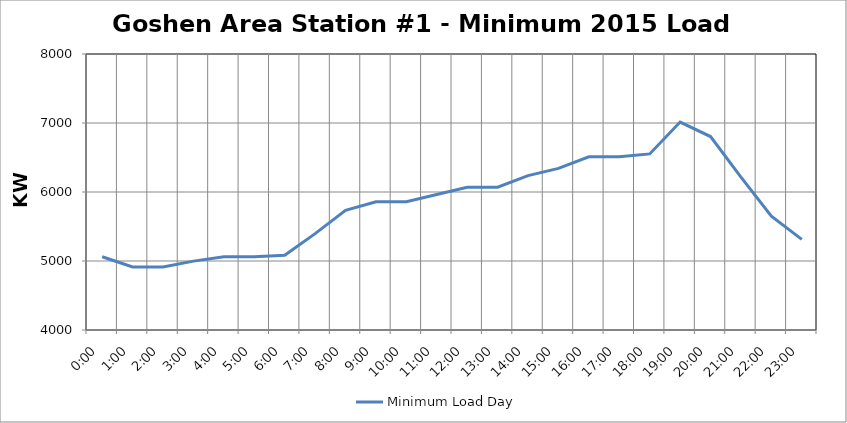
| Category | Minimum Load Day |
|---|---|
| 0.0 | 5061 |
| 0.041666666666666664 | 4914 |
| 0.08333333333333333 | 4914 |
| 0.125 | 4998 |
| 0.16666666666666666 | 5061 |
| 0.20833333333333334 | 5061 |
| 0.25 | 5082 |
| 0.2916666666666667 | 5397 |
| 0.3333333333333333 | 5733 |
| 0.375 | 5859 |
| 0.4166666666666667 | 5859 |
| 0.4583333333333333 | 5964 |
| 0.5 | 6069 |
| 0.5416666666666666 | 6069 |
| 0.5833333333333334 | 6237 |
| 0.625 | 6342 |
| 0.6666666666666666 | 6510 |
| 0.7083333333333334 | 6510 |
| 0.75 | 6552 |
| 0.7916666666666666 | 7014 |
| 0.8333333333333334 | 6804 |
| 0.875 | 6216 |
| 0.9166666666666666 | 5649 |
| 0.9583333333333334 | 5313 |